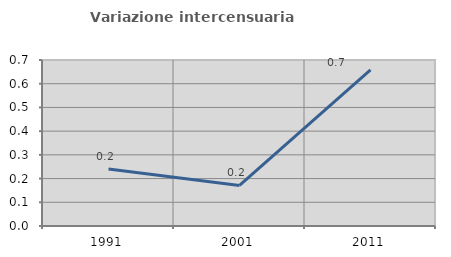
| Category | Variazione intercensuaria annua |
|---|---|
| 1991.0 | 0.241 |
| 2001.0 | 0.171 |
| 2011.0 | 0.658 |